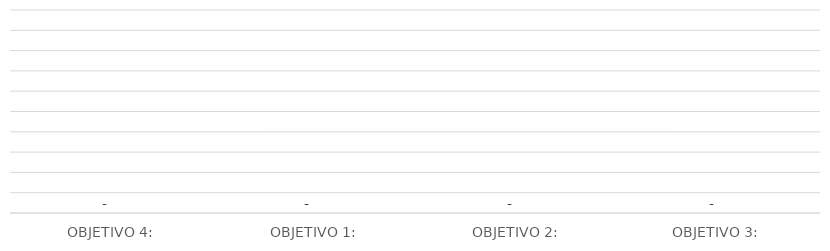
| Category | Total |
|---|---|
| OBJETIVO 4: | 0 |
| OBJETIVO 1: | 0 |
| OBJETIVO 2: | 0 |
| OBJETIVO 3:  | 0 |